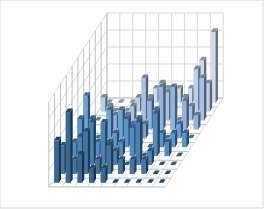
| Category | Series 0 | Series 1 | Series 2 | Series 3 | Series 4 | Series 5 | Series 6 | Series 7 | Series 8 | Series 9 |
|---|---|---|---|---|---|---|---|---|---|---|
| 0 | 0 | 0.008 | 0 | 0 | 0.025 | 0.017 | 0.008 | 0 | 0.017 | 0.025 |
| 1 | 0 | 0 | 0.008 | 0 | 0 | 0.017 | 0.008 | 0.017 | 0.008 | 0.042 |
| 2 | 0 | 0 | 0 | 0.008 | 0.017 | 0 | 0.008 | 0.025 | 0.025 | 0.017 |
| 3 | 0 | 0.008 | 0.008 | 0.008 | 0.017 | 0.008 | 0.008 | 0.025 | 0.008 | 0.008 |
| 4 | 0.008 | 0.008 | 0.025 | 0 | 0.008 | 0.017 | 0.008 | 0.008 | 0.017 | 0.008 |
| 5 | 0.008 | 0.017 | 0 | 0.017 | 0.008 | 0.017 | 0.017 | 0 | 0.008 | 0 |
| 6 | 0.008 | 0.008 | 0.017 | 0.025 | 0.017 | 0 | 0 | 0.025 | 0.008 | 0 |
| 7 | 0.008 | 0.008 | 0 | 0.025 | 0 | 0.008 | 0.025 | 0.008 | 0.008 | 0 |
| 8 | 0.025 | 0.025 | 0.008 | 0.017 | 0.008 | 0.008 | 0.008 | 0 | 0 | 0 |
| 9 | 0.042 | 0.017 | 0.025 | 0.008 | 0 | 0.008 | 0 | 0 | 0 | 0 |